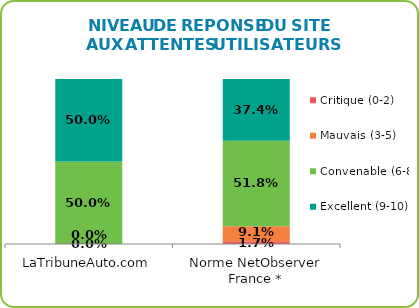
| Category | Critique (0-2) | Mauvais (3-5) | Convenable (6-8) | Excellent (9-10) |
|---|---|---|---|---|
| LaTribuneAuto.com | 0 | 0 | 0.5 | 0.5 |
| Norme NetObserver France * | 0.017 | 0.091 | 0.518 | 0.374 |